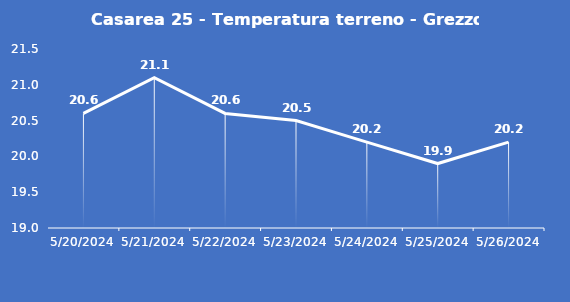
| Category | Casarea 25 - Temperatura terreno - Grezzo (°C) |
|---|---|
| 5/20/24 | 20.6 |
| 5/21/24 | 21.1 |
| 5/22/24 | 20.6 |
| 5/23/24 | 20.5 |
| 5/24/24 | 20.2 |
| 5/25/24 | 19.9 |
| 5/26/24 | 20.2 |